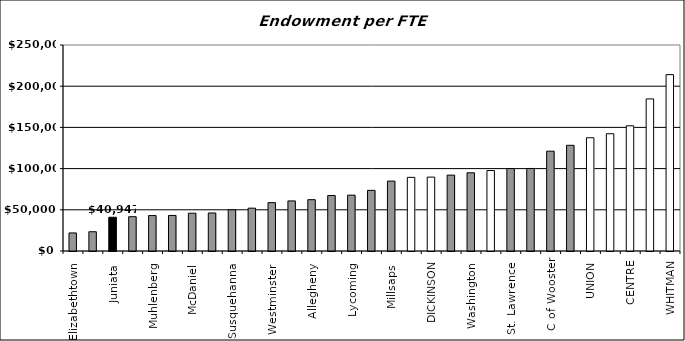
| Category | FTE |
|---|---|
| Elizabethtown  | 21901.916 |
| Leb Valley  | 23369.488 |
| Juniata  | 40947 |
| Augustana  | 41631.633 |
| Muhlenberg  | 42994.772 |
| Knox  | 43156.16 |
| McDaniel  | 45853.355 |
| Moravian | 46151.885 |
| Susquehanna  | 49985.11 |
| Wittenberg  | 51994.504 |
| Westminster  | 58696.416 |
| Wash & Jeff | 60757.809 |
| Allegheny  | 62275.852 |
| Presbyterian  | 67305.201 |
| Lycoming  | 67782.038 |
| Ursinus  | 73588.398 |
| Millsaps  | 84842.982 |
| GETTYSBURG | 89381.011 |
| DICKINSON | 89657.046 |
| Birm Southern  | 92097.237 |
| Washington  | 94924.767 |
| KENYON | 97644.533 |
| St. Lawrence  | 100037.3 |
| Wofford  | 100143.376 |
| C of Wooster | 121135.965 |
| Drew  | 128274.113 |
| UNION | 137423.894 |
| F & M * | 142302.595 |
| CENTRE | 151924.742 |
| SEWANEE | 184565.02 |
| WHITMAN | 214017.638 |